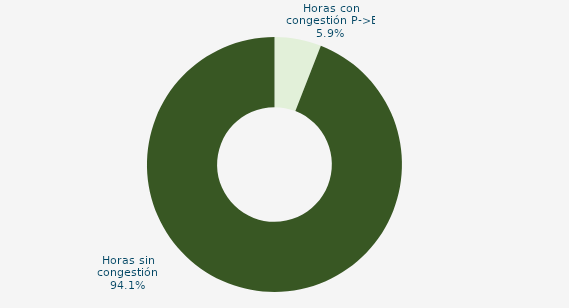
| Category | Horas con congestión E->P |
|---|---|
| Horas con congestión E->P | 0 |
| Horas con congestión P->E | 5.922 |
| Horas sin congestión | 94.078 |